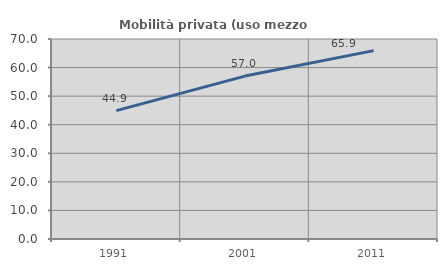
| Category | Mobilità privata (uso mezzo privato) |
|---|---|
| 1991.0 | 44.916 |
| 2001.0 | 57.022 |
| 2011.0 | 65.928 |